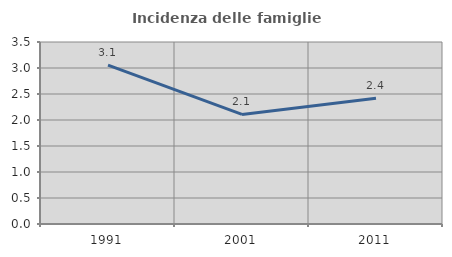
| Category | Incidenza delle famiglie numerose |
|---|---|
| 1991.0 | 3.056 |
| 2001.0 | 2.108 |
| 2011.0 | 2.419 |